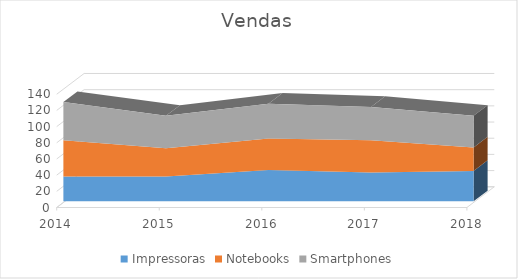
| Category | Impressoras | Notebooks | Smartphones |
|---|---|---|---|
| 2014.0 | 32 | 45 | 47 |
| 2015.0 | 32 | 35 | 40 |
| 2016.0 | 40 | 39 | 43 |
| 2017.0 | 37 | 40 | 41 |
| 2018.0 | 39 | 29 | 39 |